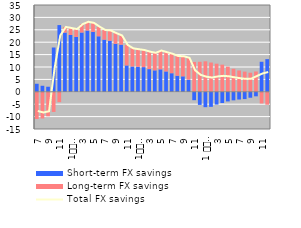
| Category | Short-term FX savings | Long-term FX savings |
|---|---|---|
| 7 | 3.242 | -10.986 |
| 8 | 2.432 | -10.766 |
| 9 | 2.044 | -9.896 |
| 10 | 17.86 | -8.121 |
| 11 | 26.898 | -4.161 |
| 12 | 23.869 | 2.284 |
| 1
2010 | 22.9 | 2.827 |
| 2 | 22.131 | 3.155 |
| 3 | 23.913 | 3.384 |
| 4 | 24.716 | 3.519 |
| 5 | 24.137 | 3.645 |
| 6 | 22.387 | 3.88 |
| 7 | 21.028 | 3.912 |
| 8 | 20.586 | 4.148 |
| 9 | 19.356 | 4.298 |
| 10 | 19.01 | 3.711 |
| 11 | 10.633 | 8.268 |
| 12 | 10.201 | 7.315 |
| 1
2011 | 10.097 | 7.071 |
| 2 | 9.954 | 6.888 |
| 3 | 9.145 | 7.033 |
| 4 | 8.653 | 7.064 |
| 5 | 9.057 | 7.587 |
| 6 | 8.208 | 7.763 |
| 7 | 7.497 | 7.832 |
| 8 | 6.496 | 7.931 |
| 9 | 6.24 | 8.102 |
| 10 | 4.895 | 8.789 |
| 11 | -3.385 | 12.041 |
| 12 | -5.279 | 12.102 |
| 1 
2012 | -6.2 | 12.299 |
| 2 | -6.058 | 11.801 |
| 3 | -5.15 | 11.338 |
| 4 | -4.513 | 10.946 |
| 5 | -3.881 | 10.147 |
| 6 | -3.441 | 9.283 |
| 7 | -3.114 | 8.605 |
| 8 | -2.931 | 8.142 |
| 9 | -2.392 | 7.694 |
| 10 | -1.82 | 8.196 |
| 11 | 12.109 | -4.715 |
| 12 | 13.168 | -5.205 |